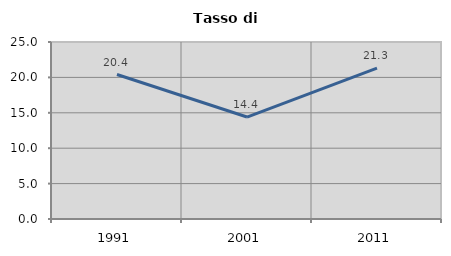
| Category | Tasso di disoccupazione   |
|---|---|
| 1991.0 | 20.408 |
| 2001.0 | 14.402 |
| 2011.0 | 21.314 |